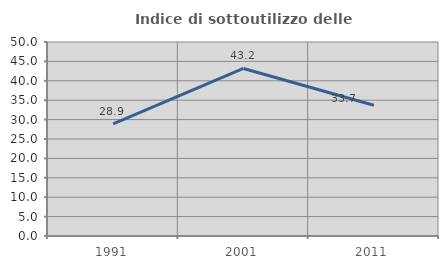
| Category | Indice di sottoutilizzo delle abitazioni  |
|---|---|
| 1991.0 | 28.889 |
| 2001.0 | 43.182 |
| 2011.0 | 33.684 |